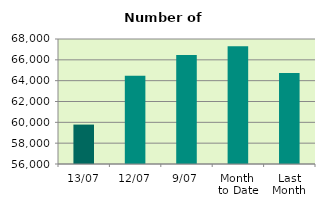
| Category | Series 0 |
|---|---|
| 13/07 | 59784 |
| 12/07 | 64464 |
| 9/07 | 66454 |
| Month 
to Date | 67297.556 |
| Last
Month | 64737.364 |